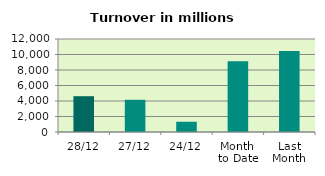
| Category | Series 0 |
|---|---|
| 28/12 | 4618.579 |
| 27/12 | 4154.169 |
| 24/12 | 1322.928 |
| Month 
to Date | 9138.416 |
| Last
Month | 10449.431 |